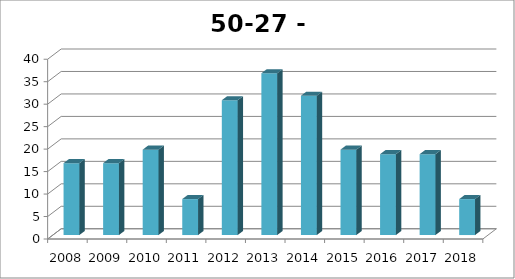
| Category | Goirle |
|---|---|
| 2008.0 | 16 |
| 2009.0 | 16 |
| 2010.0 | 19 |
| 2011.0 | 8 |
| 2012.0 | 30 |
| 2013.0 | 36 |
| 2014.0 | 31 |
| 2015.0 | 19 |
| 2016.0 | 18 |
| 2017.0 | 18 |
| 2018.0 | 8 |